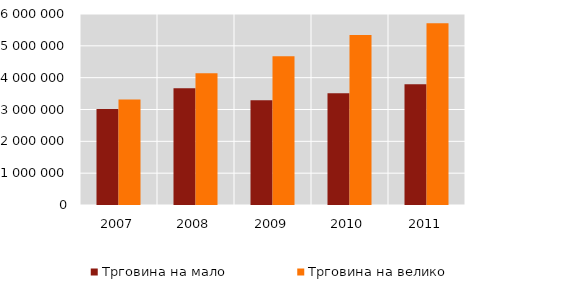
| Category | Трговина на мало | Трговина на велико |
|---|---|---|
| 2007.0 | 3017867 | 3311885 |
| 2008.0 | 3666284 | 4139177 |
| 2009.0 | 3292976 | 4668970 |
| 2010.0 | 3513862 | 5341798 |
| 2011.0 | 3791338 | 5709825 |